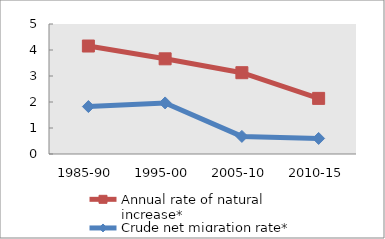
| Category | Annual rate of natural increase* | Crude net migration rate* |
|---|---|---|
| 1985-90 | 4.153 | 1.825 |
| 1995-00 | 3.661 | 1.964 |
| 2005-10 | 3.127 | 0.677 |
| 2010-15 | 2.139 | 0.598 |